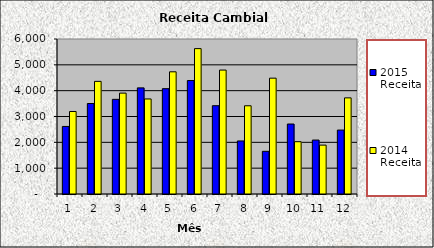
| Category | 2015 Receita | 2014 Receita |
|---|---|---|
| 0 | 2615 | 3194 |
| 1 | 3503 | 4360 |
| 2 | 3664 | 3905 |
| 3 | 4108 | 3679 |
| 4 | 4077 | 4730 |
| 5 | 4392 | 5628 |
| 6 | 3418 | 4797 |
| 7 | 2052.876 | 3415 |
| 8 | 1652 | 4484 |
| 9 | 2708.9 | 2025 |
| 10 | 2088 | 1892 |
| 11 | 2475 | 3721 |